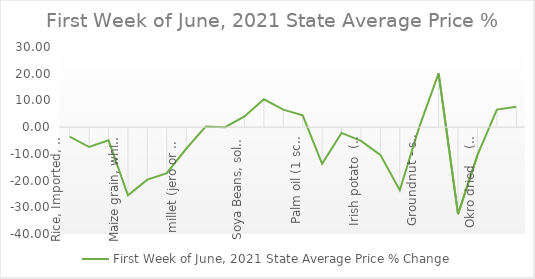
| Category | First Week of June, 2021 |
|---|---|
| Rice, Imported, High Quality Sold loose  (1 mudu) | -3.516 |
| Rice, Agric Sold Loose(Low quality) imported  (1 mudu) | -7.444 |
| Rice Local, Sold Loose   (1 mudu) | -4.955 |
| Maize grain, white sold loose   (1 mudu) | -25.534 |
| Maize grain, yellow sold loose   (1 mudu) | -19.662 |
| Sorghum (Guinea Corn) white or brown, sold loose   (1 mudu) | -17.231 |
| millet (jero or maiwa) sold loose   (1 mudu) | -8.089 |
| Beans: white black eye. Sold loose   (1 mudu) | 0.203 |
| Beans Brown, sold loose  (1 mudu) | 0 |
| Soya Beans, sold loose    (1 mudu) | 3.984 |
| Gari White, sold loose  (1 mudu) | 10.44 |
| Gari Yellow, sold loose   (1 mudu) | 6.559 |
| Palm oil (1 schnap bottle) | 4.436 |
| Yam tuber (1 Medium Size) | -13.744 |
| Cassava tuber | -2.151 |
| Irish potato  (4 Litre rubber) | -5.167 |
| Sweet potato  (5 Medium Size) | -10.37 |
| Local live chicken  | -23.623 |
| Groundnut - shelled (fresh) | 0 |
| Tomato fresh   (4 Litre rubber) | 20.116 |
| Okro fresh     (1 mudu) | -32.558 |
| Okro dried    (1 mudu) | -10.508 |
| Onion   (4 Litre rubber) | 6.569 |
| Pepper fresh   (4 Litre rubber) | 7.629 |